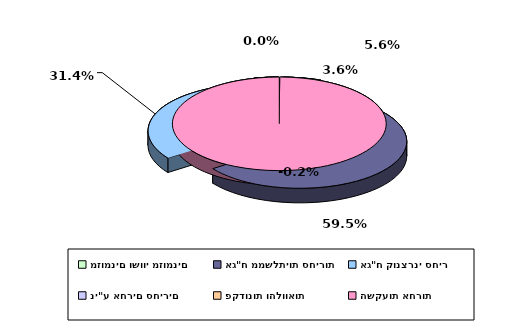
| Category | Series 0 |
|---|---|
| מזומנים ושווי מזומנים | 0.056 |
| אג"ח ממשלתיות סחירות | 0.595 |
| אג"ח קונצרני סחיר | 0.314 |
| ני"ע אחרים סחירים | 0.036 |
| פקדונות והלוואות | 0 |
| השקעות אחרות | -0.002 |